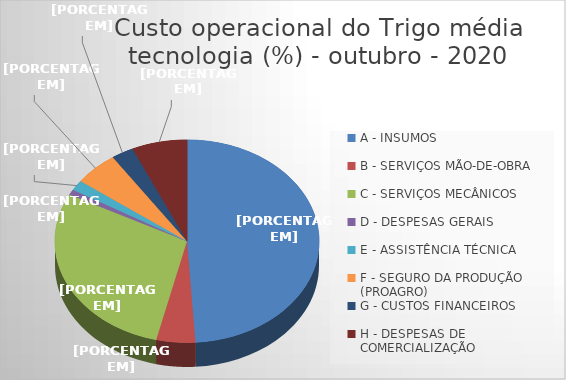
| Category | Series 0 |
|---|---|
| A - INSUMOS | 48.975 |
| B - SERVIÇOS MÃO-DE-OBRA | 4.762 |
| C - SERVIÇOS MECÂNICOS | 28.862 |
| D - DESPESAS GERAIS  | 0.826 |
| E - ASSISTÊNCIA TÉCNICA | 1.669 |
| F - SEGURO DA PRODUÇÃO (PROAGRO) | 5.423 |
| G - CUSTOS FINANCEIROS | 2.715 |
| H - DESPESAS DE COMERCIALIZAÇÃO | 6.768 |